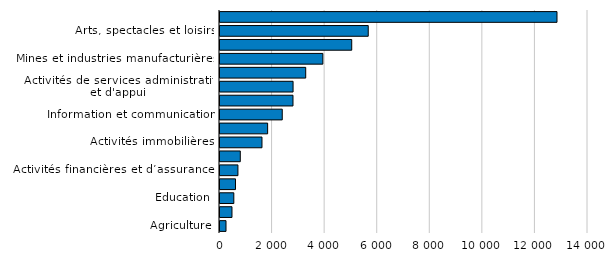
| Category | per employed |
|---|---|
| Agriculture | 228.837 |
| Services d’utilité publique | 455.396 |
| Éducation | 525.914 |
| Santé humaine et action sociale | 589.537 |
| Activités financières et d’assurances | 682.213 |
| Autres activités de services | 771.654 |
| Activités immobilières | 1596.749 |
| Bâtiment | 1811.98 |
| Information et communication | 2368.254 |
| Activités spécialisées, scientifiques et techniques | 2777.078 |
| Activités de services administratifs et d'appui | 2780.065 |
| Commerce | 3260.848 |
| Mines et industries manufacturières | 3912.566 |
| Transport et stockage | 5011.567 |
| Arts, spectacles et loisirs | 5639.791 |
| Services d’hébergement et de restauration | 12820.365 |